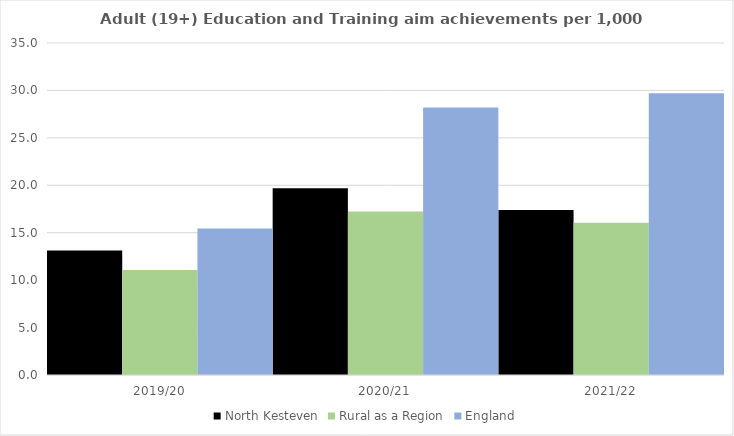
| Category | North Kesteven | Rural as a Region | England |
|---|---|---|---|
| 2019/20 | 13.136 | 11.081 | 15.446 |
| 2020/21 | 19.682 | 17.224 | 28.211 |
| 2021/22 | 17.391 | 16.063 | 29.711 |